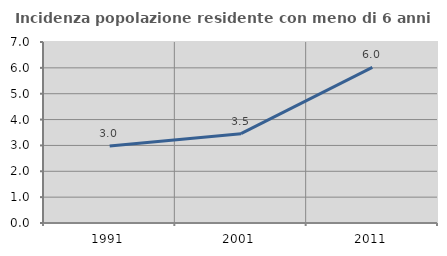
| Category | Incidenza popolazione residente con meno di 6 anni |
|---|---|
| 1991.0 | 2.982 |
| 2001.0 | 3.455 |
| 2011.0 | 6.02 |